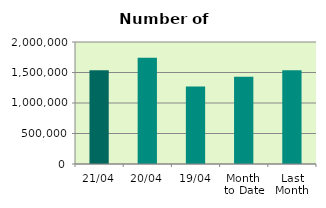
| Category | Series 0 |
|---|---|
| 21/04 | 1537350 |
| 20/04 | 1741634 |
| 19/04 | 1269680 |
| Month 
to Date | 1428576.154 |
| Last
Month | 1535393.739 |